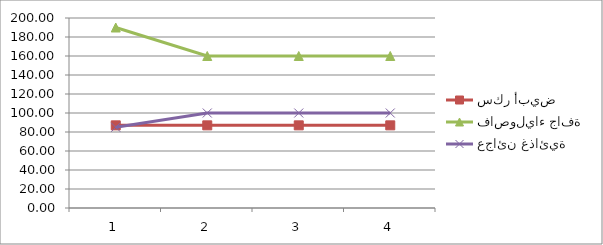
| Category | سكر أبيض | فاصولياء جافة | عجائن غذائية |
|---|---|---|---|
| 0 | 87 | 190 | 85 |
| 1 | 87 | 160 | 100 |
| 2 | 87 | 160 | 100 |
| 3 | 87 | 160 | 100 |